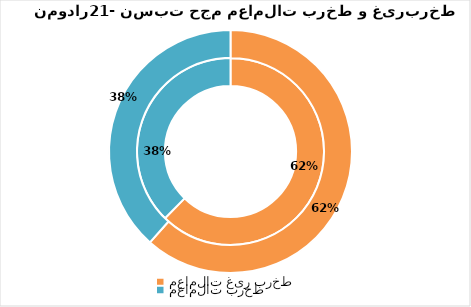
| Category | دی 96 | بهمن 96 |
|---|---|---|
| معاملات غیر برخط | 19921233076.5 | 18372837622.5 |
| معاملات برخط | 12028887741.5 | 11484304126.5 |